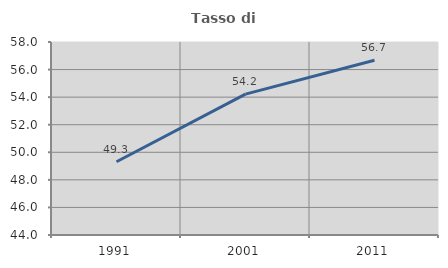
| Category | Tasso di occupazione   |
|---|---|
| 1991.0 | 49.312 |
| 2001.0 | 54.217 |
| 2011.0 | 56.676 |